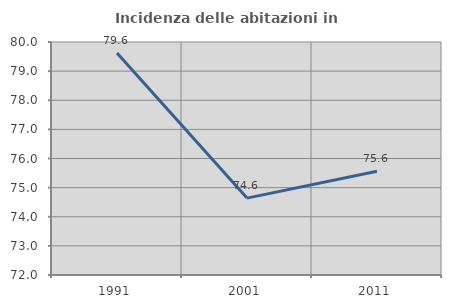
| Category | Incidenza delle abitazioni in proprietà  |
|---|---|
| 1991.0 | 79.619 |
| 2001.0 | 74.641 |
| 2011.0 | 75.563 |